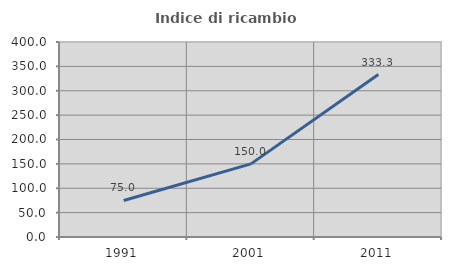
| Category | Indice di ricambio occupazionale  |
|---|---|
| 1991.0 | 75 |
| 2001.0 | 150 |
| 2011.0 | 333.333 |